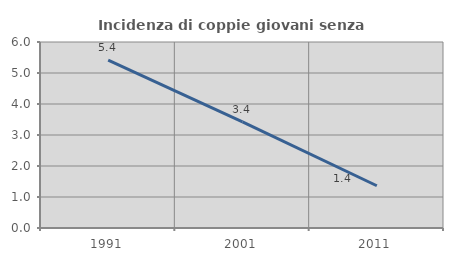
| Category | Incidenza di coppie giovani senza figli |
|---|---|
| 1991.0 | 5.416 |
| 2001.0 | 3.425 |
| 2011.0 | 1.363 |